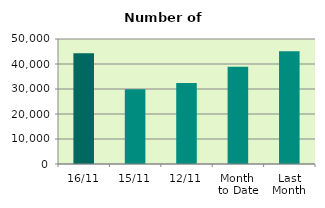
| Category | Series 0 |
|---|---|
| 16/11 | 44256 |
| 15/11 | 29908 |
| 12/11 | 32386 |
| Month 
to Date | 38902.333 |
| Last
Month | 45060.857 |